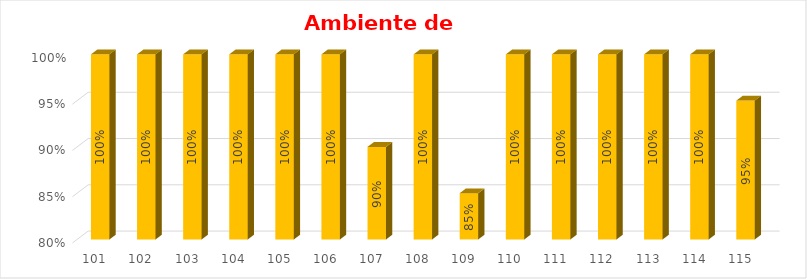
| Category | % Avance |
|---|---|
| 101.0 | 1 |
| 102.0 | 1 |
| 103.0 | 1 |
| 104.0 | 1 |
| 105.0 | 1 |
| 106.0 | 1 |
| 107.0 | 0.9 |
| 108.0 | 1 |
| 109.0 | 0.85 |
| 110.0 | 1 |
| 111.0 | 1 |
| 112.0 | 1 |
| 113.0 | 1 |
| 114.0 | 1 |
| 115.0 | 0.95 |